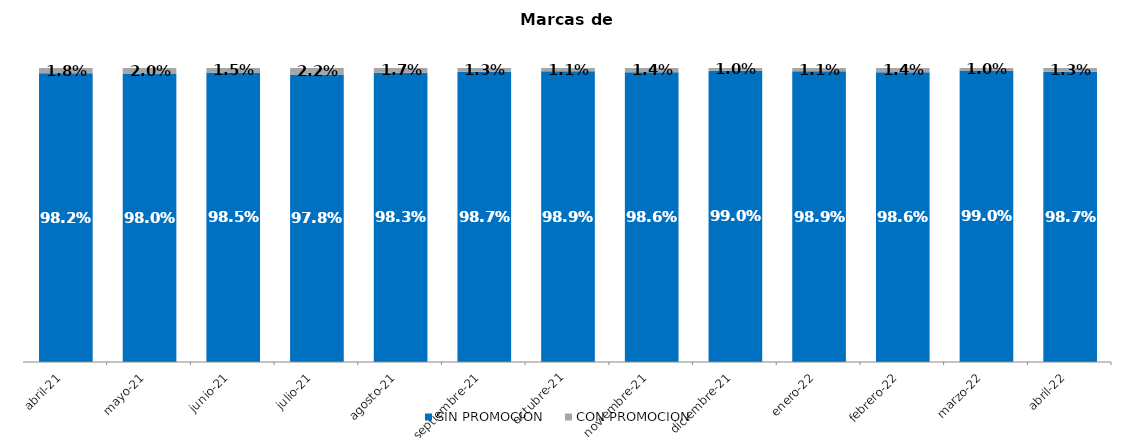
| Category | SIN PROMOCION   | CON PROMOCION   |
|---|---|---|
| 2021-04-01 | 0.982 | 0.018 |
| 2021-05-01 | 0.98 | 0.02 |
| 2021-06-01 | 0.985 | 0.015 |
| 2021-07-01 | 0.978 | 0.022 |
| 2021-08-01 | 0.983 | 0.017 |
| 2021-09-01 | 0.987 | 0.013 |
| 2021-10-01 | 0.989 | 0.011 |
| 2021-11-01 | 0.986 | 0.014 |
| 2021-12-01 | 0.99 | 0.01 |
| 2022-01-01 | 0.989 | 0.011 |
| 2022-02-01 | 0.986 | 0.014 |
| 2022-03-01 | 0.99 | 0.01 |
| 2022-04-01 | 0.987 | 0.013 |